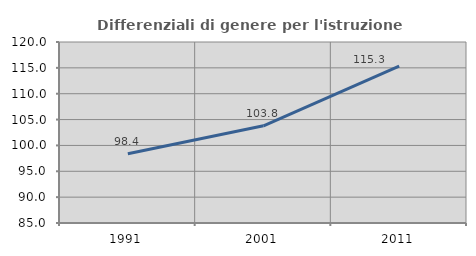
| Category | Differenziali di genere per l'istruzione superiore |
|---|---|
| 1991.0 | 98.395 |
| 2001.0 | 103.788 |
| 2011.0 | 115.341 |